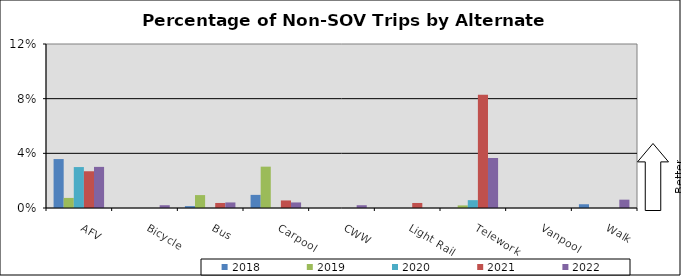
| Category | 2018 | 2019 | 2020 | 2021 | 2022 |
|---|---|---|---|---|---|
| AFV | 0.036 | 0.007 | 0.03 | 0.027 | 0.03 |
| Bicycle | 0 | 0 | 0 | 0 | 0.002 |
| Bus | 0.001 | 0.009 | 0 | 0.004 | 0.004 |
| Carpool | 0.01 | 0.03 | 0 | 0.006 | 0.004 |
| CWW | 0 | 0 | 0 | 0 | 0.002 |
| Light Rail | 0 | 0 | 0 | 0.004 | 0 |
| Telework | 0 | 0.002 | 0.006 | 0.083 | 0.037 |
| Vanpool | 0 | 0 | 0 | 0 | 0 |
| Walk | 0.003 | 0 | 0 | 0 | 0.006 |